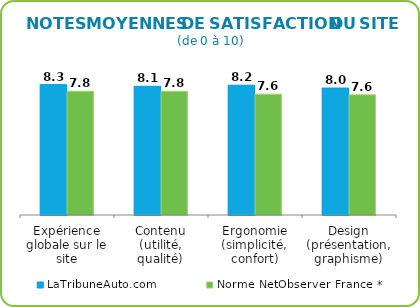
| Category | LaTribuneAuto.com | Norme NetObserver France * |
|---|---|---|
| Expérience globale sur le site | 8.25 | 7.833 |
| Contenu (utilité, qualité) | 8.143 | 7.828 |
| Ergonomie (simplicité, confort) | 8.214 | 7.646 |
| Design (présentation, graphisme) | 8.036 | 7.605 |